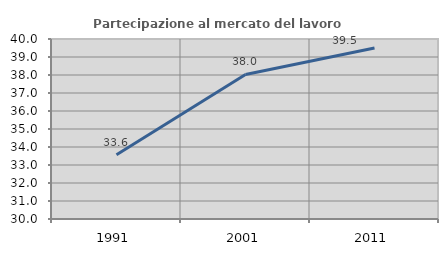
| Category | Partecipazione al mercato del lavoro  femminile |
|---|---|
| 1991.0 | 33.568 |
| 2001.0 | 38.031 |
| 2011.0 | 39.504 |